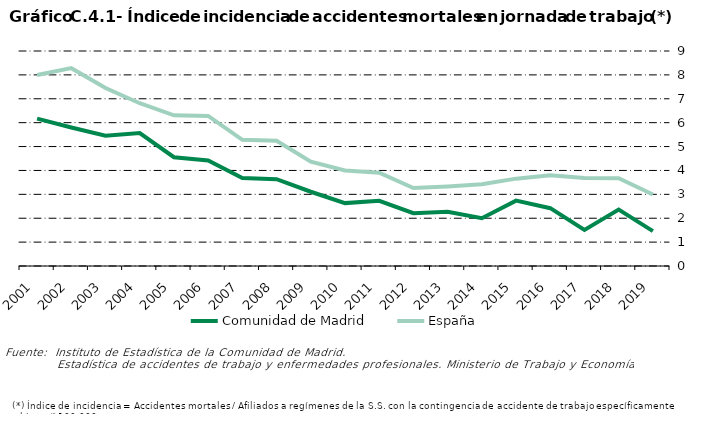
| Category | Comunidad de Madrid | España |
|---|---|---|
| 2001.0 | 6.171 | 7.997 |
| 2002.0 | 5.796 | 8.282 |
| 2003.0 | 5.454 | 7.447 |
| 2004.0 | 5.566 | 6.814 |
| 2005.0 | 4.553 | 6.31 |
| 2006.0 | 4.42 | 6.28 |
| 2007.0 | 3.68 | 5.28 |
| 2008.0 | 3.636 | 5.243 |
| 2009.0 | 3.109 | 4.364 |
| 2010.0 | 2.633 | 3.996 |
| 2011.0 | 2.727 | 3.906 |
| 2012.0 | 2.212 | 3.263 |
| 2013.0 | 2.274 | 3.327 |
| 2014.0 | 1.998 | 3.422 |
| 2015.0 | 2.738 | 3.657 |
| 2016.0 | 2.42 | 3.797 |
| 2017.0 | 1.508 | 3.686 |
| 2018.0 | 2.364 | 3.671 |
| 2019.0 | 1.459 | 2.994 |